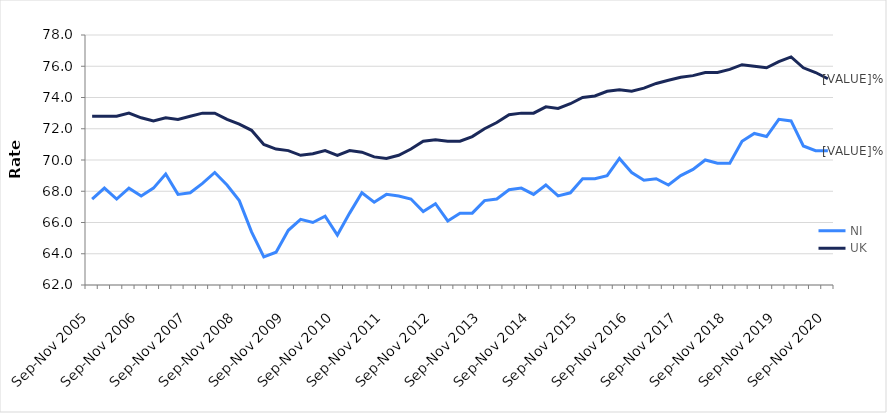
| Category | NI | UK |
|---|---|---|
| Sep-Nov 2005 | 67.5 | 72.8 |
| Dec-Feb 2006 | 68.2 | 72.8 |
| Mar-May 2006 | 67.5 | 72.8 |
| Jun-Aug 2006 | 68.2 | 73 |
| Sep-Nov 2006 | 67.7 | 72.7 |
| Dec-Feb 2007 | 68.2 | 72.5 |
| Mar-May 2007 | 69.1 | 72.7 |
| Jun-Aug 2007 | 67.8 | 72.6 |
| Sep-Nov 2007 | 67.9 | 72.8 |
| Dec-Feb 2008 | 68.5 | 73 |
| Mar-May 2008 | 69.2 | 73 |
| Jun-Aug 2008 | 68.4 | 72.6 |
| Sep-Nov 2008 | 67.4 | 72.3 |
| Dec-Feb 2009 | 65.4 | 71.9 |
| Mar-May 2009 | 63.8 | 71 |
| Jun-Aug 2009 | 64.1 | 70.7 |
| Sep-Nov 2009 | 65.5 | 70.6 |
| Dec-Feb 2010 | 66.2 | 70.3 |
| Mar-May 2010 | 66 | 70.4 |
| Jun-Aug 2010 | 66.4 | 70.6 |
| Sep-Nov 2010 | 65.2 | 70.3 |
| Dec-Feb 2011 | 66.6 | 70.6 |
| Mar-May 2011 | 67.9 | 70.5 |
| Jun-Aug 2011 | 67.3 | 70.2 |
| Sep-Nov 2011 | 67.8 | 70.1 |
| Dec-Feb 2012 | 67.7 | 70.3 |
| Mar-May 2012 | 67.5 | 70.7 |
| Jun-Aug 2012 | 66.7 | 71.2 |
| Sep-Nov 2012 | 67.2 | 71.3 |
| Dec-Feb 2013 | 66.1 | 71.2 |
| Mar-May 2013 | 66.6 | 71.2 |
| Jun-Aug 2013 | 66.6 | 71.5 |
| Sep-Nov 2013 | 67.4 | 72 |
| Dec-Feb 2014 | 67.5 | 72.4 |
| Mar-May 2014 | 68.1 | 72.9 |
| Jun-Aug 2014 | 68.2 | 73 |
| Sep-Nov 2014 | 67.8 | 73 |
| Dec-Feb 2015 | 68.4 | 73.4 |
| Mar-May 2015 | 67.7 | 73.3 |
| Jun-Aug 2015 | 67.9 | 73.6 |
| Sep-Nov 2015 | 68.8 | 74 |
| Dec-Feb 2016 | 68.8 | 74.1 |
| Mar-May 2016 | 69 | 74.4 |
| Jun-Aug 2016 | 70.1 | 74.5 |
| Sep-Nov 2016 | 69.2 | 74.4 |
| Dec-Feb 2017 | 68.7 | 74.6 |
| Mar-May 2017 | 68.8 | 74.9 |
| Jun-Aug 2017 | 68.4 | 75.1 |
| Sep-Nov 2017 | 69 | 75.3 |
| Dec-Feb 2018 | 69.4 | 75.4 |
| Mar-May 2018 | 70 | 75.6 |
| Jun-Aug 2018 | 69.8 | 75.6 |
| Sep-Nov 2018 | 69.8 | 75.8 |
| Dec-Feb 2019 | 71.2 | 76.1 |
| Mar-May 2019 | 71.7 | 76 |
| Jun-Aug 2019 | 71.5 | 75.9 |
| Sep-Nov 2019 | 72.6 | 76.3 |
| Dec-Feb 2020 | 72.5 | 76.6 |
| Mar-May 2020 | 70.9 | 75.9 |
| Jun-Aug 2020 | 70.6 | 75.6 |
| Sep-Nov 2020 | 70.6 | 75.2 |